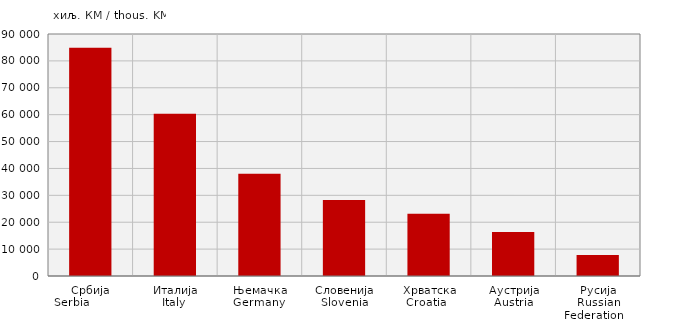
| Category | Увоз
Import |
|---|---|
| Србија
Serbia            | 84843 |
| Италија
Italy  | 60296 |
| Њемачка
Germany  | 38042 |
| Словенија
Slovenia | 28264 |
| Хрватска
Croatia   | 23193 |
| Аустрија
Austria | 16358 |
| Русија
Russian Federation    | 7815 |